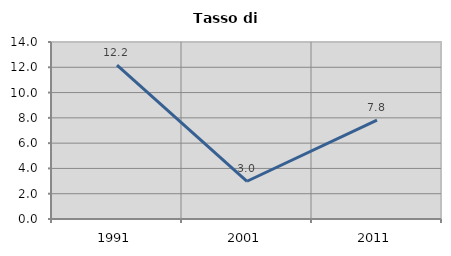
| Category | Tasso di disoccupazione   |
|---|---|
| 1991.0 | 12.168 |
| 2001.0 | 2.985 |
| 2011.0 | 7.822 |